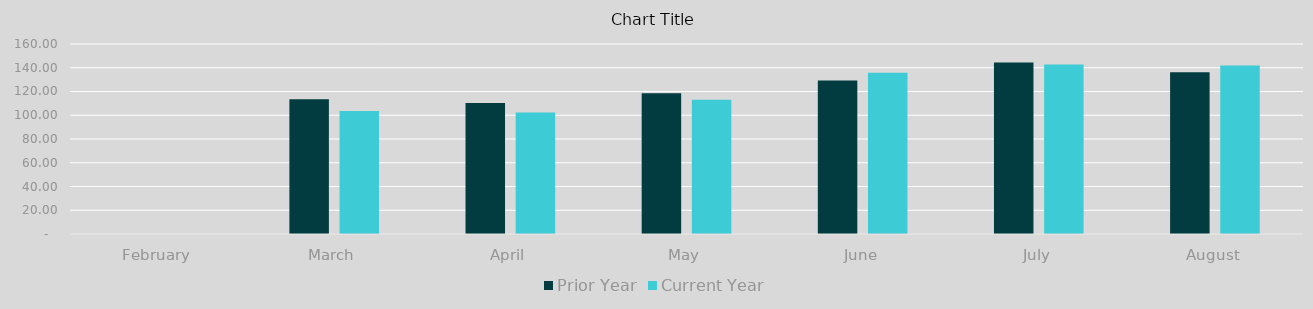
| Category | Prior Year | Current Year |
|---|---|---|
| February | 0 | 0 |
| March | 113.435 | 103.589 |
| April | 110.378 | 102.234 |
| May | 118.45 | 112.97 |
| June | 129.166 | 135.774 |
| July | 144.406 | 142.69 |
| August | 136.158 | 141.835 |